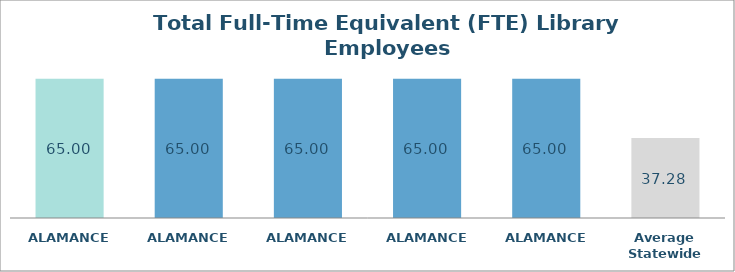
| Category | Series 0 |
|---|---|
| ALAMANCE  | 65 |
| ALAMANCE  | 65 |
| ALAMANCE  | 65 |
| ALAMANCE  | 65 |
| ALAMANCE  | 65 |
| Average Statewide | 37.285 |